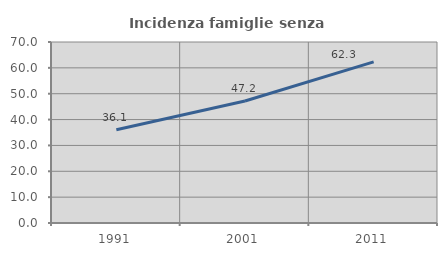
| Category | Incidenza famiglie senza nuclei |
|---|---|
| 1991.0 | 36.054 |
| 2001.0 | 47.183 |
| 2011.0 | 62.308 |